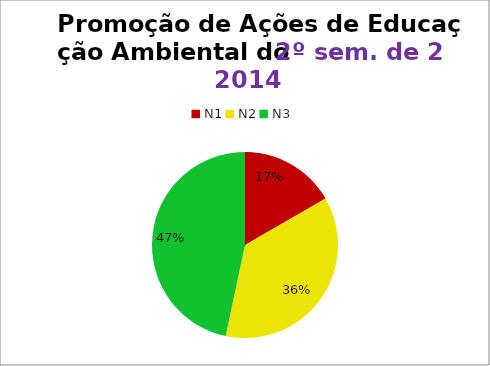
| Category | 2º/14 |
|---|---|
| N1 | 5 |
| N2 | 11 |
| N3 | 14 |